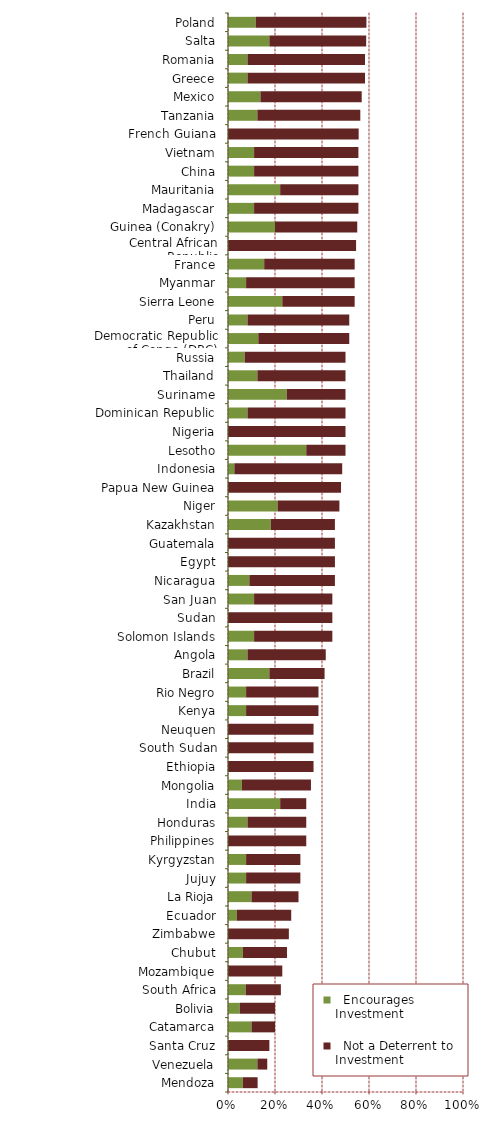
| Category |   Encourages Investment |   Not a Deterrent to Investment |
|---|---|---|
| Mendoza | 0.063 | 0.063 |
| Venezuela | 0.125 | 0.042 |
| Santa Cruz | 0 | 0.176 |
| Catamarca | 0.1 | 0.1 |
| Bolivia | 0.05 | 0.15 |
| South Africa | 0.075 | 0.15 |
| Mozambique | 0 | 0.231 |
| Chubut | 0.063 | 0.188 |
| Zimbabwe | 0 | 0.259 |
| Ecuador | 0.038 | 0.231 |
| La Rioja | 0.1 | 0.2 |
| Jujuy | 0.077 | 0.231 |
| Kyrgyzstan | 0.077 | 0.231 |
| Philippines | 0 | 0.333 |
| Honduras | 0.083 | 0.25 |
| India | 0.222 | 0.111 |
| Mongolia | 0.059 | 0.294 |
| Ethiopia | 0 | 0.364 |
| South Sudan | 0 | 0.364 |
| Neuquen | 0 | 0.364 |
| Kenya | 0.077 | 0.308 |
| Rio Negro | 0.077 | 0.308 |
| Brazil | 0.176 | 0.235 |
| Angola | 0.083 | 0.333 |
| Solomon Islands | 0.111 | 0.333 |
| Sudan | 0 | 0.444 |
| San Juan | 0.111 | 0.333 |
| Nicaragua | 0.091 | 0.364 |
| Egypt | 0 | 0.455 |
| Guatemala | 0 | 0.455 |
| Kazakhstan | 0.182 | 0.273 |
| Niger | 0.211 | 0.263 |
| Papua New Guinea | 0 | 0.481 |
| Indonesia | 0.027 | 0.459 |
| Lesotho | 0.333 | 0.167 |
| Nigeria | 0 | 0.5 |
| Dominican Republic | 0.083 | 0.417 |
| Suriname | 0.25 | 0.25 |
| Thailand | 0.125 | 0.375 |
| Russia | 0.071 | 0.429 |
| Democratic Republic of Congo (DRC) | 0.129 | 0.387 |
| Peru | 0.083 | 0.433 |
| Sierra Leone | 0.231 | 0.308 |
| Myanmar | 0.077 | 0.462 |
| France | 0.154 | 0.385 |
| Central African Republic | 0 | 0.545 |
| Guinea (Conakry) | 0.2 | 0.35 |
| Madagascar | 0.111 | 0.444 |
| Mauritania | 0.222 | 0.333 |
| China | 0.111 | 0.444 |
| Vietnam | 0.111 | 0.444 |
| French Guiana | 0 | 0.556 |
| Tanzania | 0.125 | 0.438 |
| Mexico | 0.138 | 0.431 |
| Greece | 0.083 | 0.5 |
| Romania | 0.083 | 0.5 |
| Salta | 0.176 | 0.412 |
| Poland | 0.118 | 0.471 |